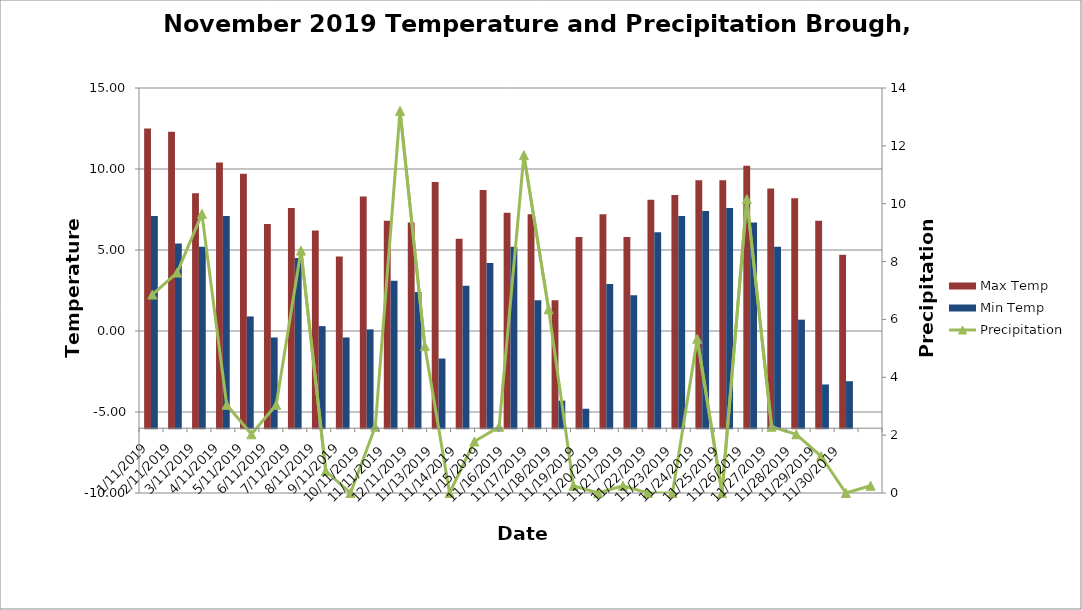
| Category | Max Temp | Min Temp |
|---|---|---|
| 11/01/2019 | 12.5 | 7.1 |
| 11/02/2019 | 12.3 | 5.4 |
| 11/03/2019 | 8.5 | 5.2 |
| 11/04/2019 | 10.4 | 7.1 |
| 11/05/2019 | 9.7 | 0.9 |
| 11/06/2019 | 6.6 | -0.4 |
| 11/07/2019 | 7.6 | 4.5 |
| 11/08/2019 | 6.2 | 0.3 |
| 11/09/2019 | 4.6 | -0.4 |
| 11/10/2019 | 8.3 | 0.1 |
| 11/11/2019 | 6.8 | 3.1 |
| 11/12/2019 | 6.7 | 2.4 |
| 11/13/2019 | 9.2 | -1.7 |
| 11/14/2019 | 5.7 | 2.8 |
| 11/15/2019 | 8.7 | 4.2 |
| 11/16/2019 | 7.3 | 5.2 |
| 11/17/2019 | 7.2 | 1.9 |
| 11/18/2019 | 1.9 | -4.3 |
| 11/19/2019 | 5.8 | -4.8 |
| 11/20/2019 | 7.2 | 2.9 |
| 11/21/2019 | 5.8 | 2.2 |
| 11/22/2019 | 8.1 | 6.1 |
| 11/23/2019 | 8.4 | 7.1 |
| 11/24/2019 | 9.3 | 7.4 |
| 11/25/2019 | 9.3 | 7.6 |
| 11/26/2019 | 10.2 | 6.7 |
| 11/27/2019 | 8.8 | 5.2 |
| 11/28/2019 | 8.2 | 0.7 |
| 11/29/2019 | 6.8 | -3.3 |
| 11/30/2019 | 4.7 | -3.1 |